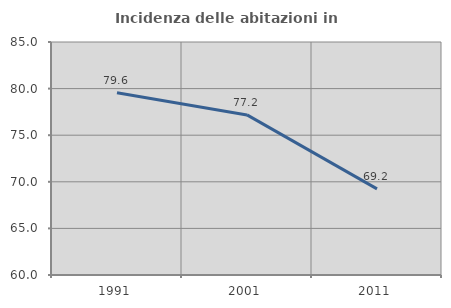
| Category | Incidenza delle abitazioni in proprietà  |
|---|---|
| 1991.0 | 79.565 |
| 2001.0 | 77.177 |
| 2011.0 | 69.242 |